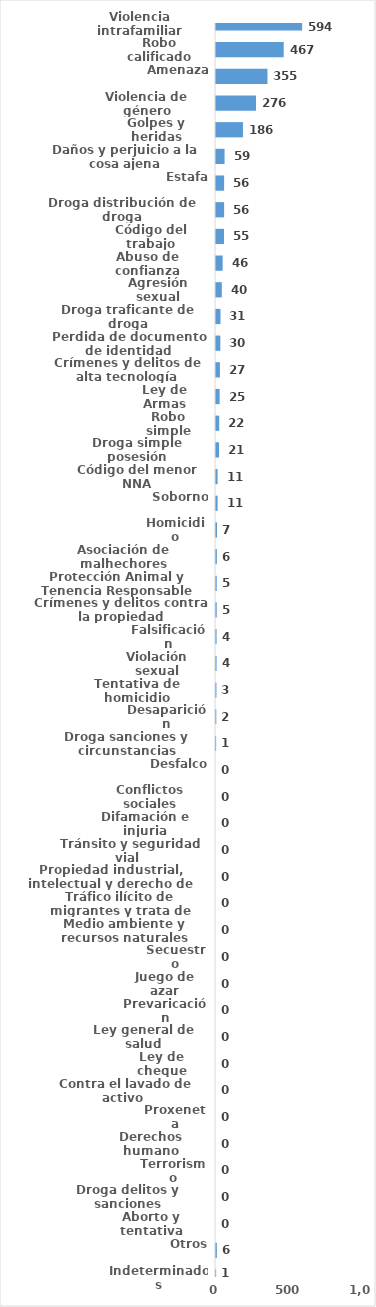
| Category | Series 0 |
|---|---|
| Violencia intrafamiliar | 594 |
| Robo calificado | 467 |
| Amenaza | 355 |
| Violencia de género | 276 |
| Golpes y heridas | 186 |
| Daños y perjuicio a la cosa ajena | 59 |
| Estafa | 56 |
| Droga distribución de droga | 56 |
| Código del trabajo | 55 |
| Abuso de confianza | 46 |
| Agresión sexual | 40 |
| Droga traficante de droga | 31 |
| Perdida de documento de identidad | 30 |
| Crímenes y delitos de alta tecnología | 27 |
| Ley de Armas | 25 |
| Robo simple | 22 |
| Droga simple posesión | 21 |
| Código del menor NNA | 11 |
| Soborno | 11 |
| Homicidio | 7 |
| Asociación de malhechores | 6 |
| Protección Animal y Tenencia Responsable | 5 |
| Crímenes y delitos contra la propiedad | 5 |
| Falsificación | 4 |
| Violación sexual | 4 |
| Tentativa de homicidio | 3 |
| Desaparición | 2 |
| Droga sanciones y circunstancias agravantes | 1 |
| Desfalco | 0 |
| Conflictos sociales | 0 |
| Difamación e injuria | 0 |
| Tránsito y seguridad vial  | 0 |
| Propiedad industrial, intelectual y derecho de autor | 0 |
| Tráfico ilícito de migrantes y trata de personas | 0 |
| Medio ambiente y recursos naturales | 0 |
| Secuestro | 0 |
| Juego de azar | 0 |
| Prevaricación | 0 |
| Ley general de salud | 0 |
| Ley de cheque | 0 |
| Contra el lavado de activo  | 0 |
| Proxeneta | 0 |
| Derechos humano | 0 |
| Terrorismo | 0 |
| Droga delitos y sanciones | 0 |
| Aborto y tentativa | 0 |
| Otros | 6 |
| Indeterminados | 1 |